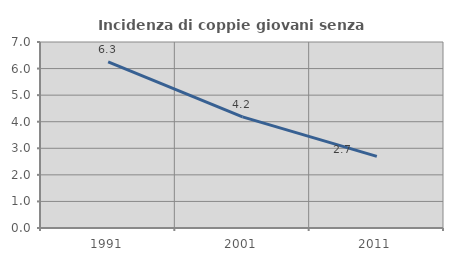
| Category | Incidenza di coppie giovani senza figli |
|---|---|
| 1991.0 | 6.25 |
| 2001.0 | 4.181 |
| 2011.0 | 2.698 |